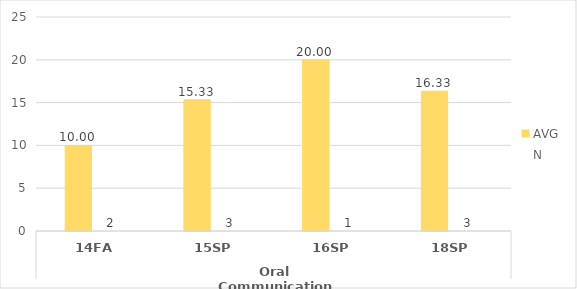
| Category | LA.AA - AVG | LA.AA - N |
|---|---|---|
| 0 | 10 | 2 |
| 1 | 15.333 | 3 |
| 2 | 20 | 1 |
| 3 | 16.333 | 3 |